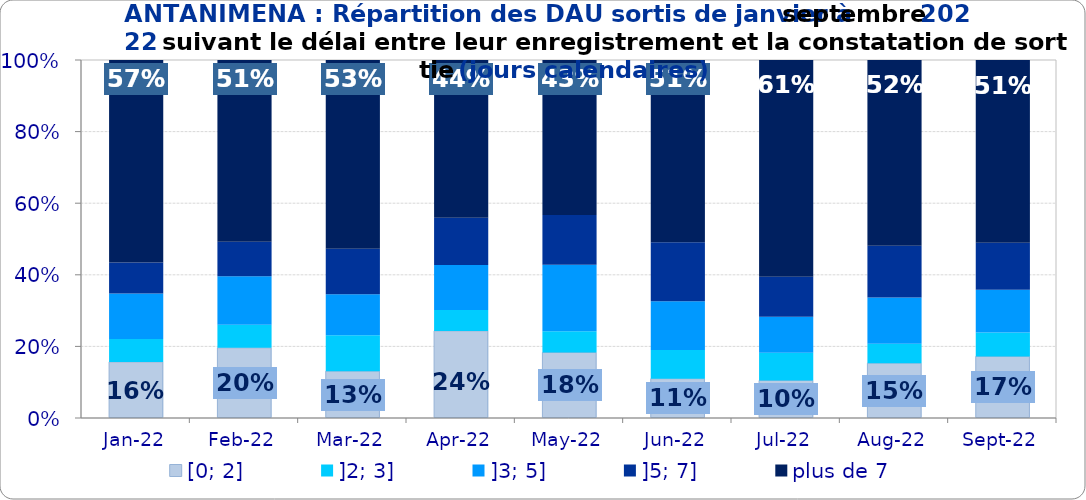
| Category | [0; 2] | ]2; 3] | ]3; 5] | ]5; 7] | plus de 7 |
|---|---|---|---|---|---|
| 2022-01-01 | 0.157 | 0.064 | 0.127 | 0.087 | 0.566 |
| 2022-02-01 | 0.196 | 0.065 | 0.136 | 0.096 | 0.508 |
| 2022-03-01 | 0.131 | 0.1 | 0.115 | 0.127 | 0.527 |
| 2022-04-01 | 0.243 | 0.058 | 0.126 | 0.132 | 0.441 |
| 2022-05-01 | 0.183 | 0.059 | 0.186 | 0.139 | 0.433 |
| 2022-06-01 | 0.11 | 0.08 | 0.136 | 0.165 | 0.509 |
| 2022-07-01 | 0.105 | 0.077 | 0.101 | 0.112 | 0.606 |
| 2022-08-01 | 0.153 | 0.054 | 0.13 | 0.145 | 0.519 |
| 2022-09-01 | 0.172 | 0.067 | 0.119 | 0.131 | 0.511 |